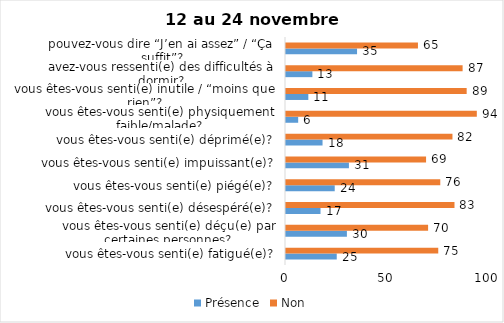
| Category | Présence | Non |
|---|---|---|
| vous êtes-vous senti(e) fatigué(e)? | 25 | 75 |
| vous êtes-vous senti(e) déçu(e) par certaines personnes? | 30 | 70 |
| vous êtes-vous senti(e) désespéré(e)? | 17 | 83 |
| vous êtes-vous senti(e) piégé(e)? | 24 | 76 |
| vous êtes-vous senti(e) impuissant(e)? | 31 | 69 |
| vous êtes-vous senti(e) déprimé(e)? | 18 | 82 |
| vous êtes-vous senti(e) physiquement faible/malade? | 6 | 94 |
| vous êtes-vous senti(e) inutile / “moins que rien”? | 11 | 89 |
| avez-vous ressenti(e) des difficultés à dormir? | 13 | 87 |
| pouvez-vous dire “J’en ai assez” / “Ça suffit”? | 35 | 65 |